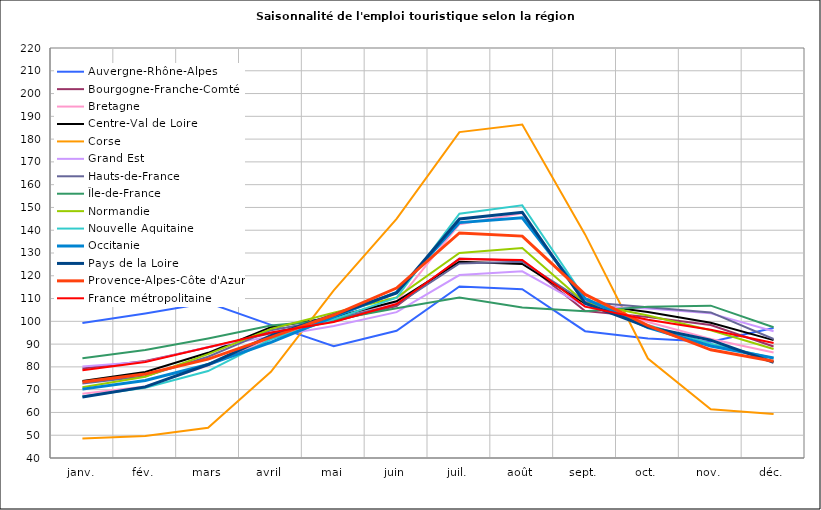
| Category | Auvergne-Rhône-Alpes | Bourgogne-Franche-Comté | Bretagne | Centre-Val de Loire | Corse | Grand Est | Hauts-de-France | Île-de-France | Normandie | Nouvelle Aquitaine | Occitanie | Pays de la Loire | Provence-Alpes-Côte d'Azur | France métropolitaine |
|---|---|---|---|---|---|---|---|---|---|---|---|---|---|---|
| janv. | 99.317 | 79.335 | 68.235 | 73.828 | 48.599 | 80.144 | 72.758 | 83.83 | 71.102 | 66.961 | 70.232 | 66.754 | 73.332 | 78.525 |
| fév. | 103.453 | 82.6 | 71.37 | 77.766 | 49.658 | 82.312 | 75.895 | 87.39 | 75.656 | 70.819 | 74.058 | 71.22 | 76.846 | 82.133 |
| mars | 108.121 | 88.566 | 80.567 | 86.174 | 53.292 | 88.768 | 84.452 | 92.445 | 85.595 | 78.166 | 81.055 | 81.044 | 83.415 | 88.614 |
| avril | 98.436 | 94.796 | 92.537 | 97.412 | 77.843 | 93.186 | 96.111 | 98.129 | 96.677 | 92.129 | 90.776 | 93.747 | 92.937 | 95.123 |
| mai | 89.099 | 100.057 | 101.356 | 101.768 | 113.559 | 97.933 | 101.04 | 100.726 | 103.744 | 100.917 | 101.967 | 102.789 | 102.772 | 99.751 |
| juin | 95.887 | 106.749 | 108.433 | 108.795 | 144.976 | 104.05 | 107.321 | 105.733 | 110.424 | 110.353 | 112.75 | 112.479 | 114.617 | 107.619 |
| juil. | 115.287 | 127.543 | 142.636 | 126.124 | 183.079 | 120.307 | 125.425 | 110.496 | 130 | 147.276 | 143.354 | 144.928 | 138.817 | 127.412 |
| août | 114.13 | 126.651 | 147.461 | 125.173 | 186.425 | 121.964 | 126.17 | 106.053 | 132.194 | 150.924 | 145.428 | 147.885 | 137.415 | 126.959 |
| sept. | 95.673 | 104.508 | 109.142 | 107.773 | 138.158 | 106.569 | 108.475 | 104.475 | 108.115 | 110.148 | 109.991 | 107.94 | 111.812 | 106.435 |
| oct. | 92.499 | 101.903 | 99.696 | 104.06 | 83.677 | 105.603 | 106.195 | 106.445 | 102.578 | 98.369 | 97.302 | 97.503 | 98.084 | 100.656 |
| nov. | 91.03 | 98.371 | 92.283 | 99.392 | 61.439 | 103.497 | 103.902 | 106.885 | 96.046 | 90.133 | 89.195 | 91.756 | 87.494 | 96.321 |
| déc. | 97.066 | 88.922 | 86.286 | 91.735 | 59.297 | 95.668 | 92.256 | 97.395 | 87.868 | 83.804 | 83.893 | 81.955 | 82.459 | 90.453 |